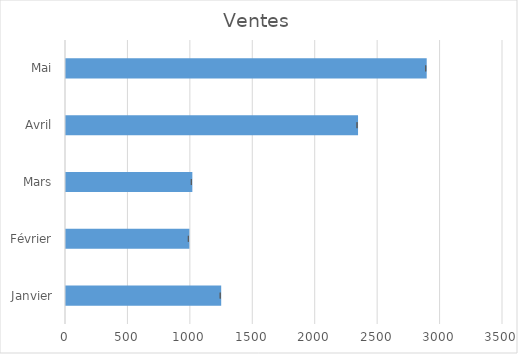
| Category | Ventes |
|---|---|
| Janvier | 1243 |
| Février | 988 |
| Mars | 1012 |
| Avril | 2339 |
| Mai | 2889 |